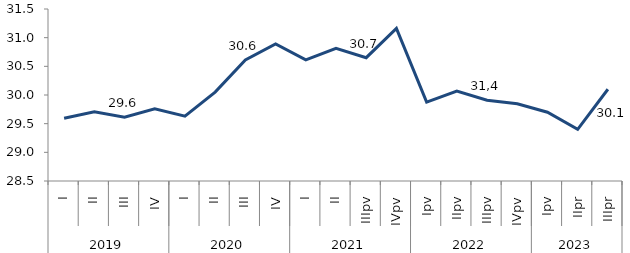
| Category | Series 0 |
|---|---|
| 0 | 29.595 |
| 1 | 29.707 |
| 2 | 29.612 |
| 3 | 29.758 |
| 4 | 29.631 |
| 5 | 30.051 |
| 6 | 30.612 |
| 7 | 30.89 |
| 8 | 30.612 |
| 9 | 30.813 |
| 10 | 30.651 |
| 11 | 31.16 |
| 12 | 29.877 |
| 13 | 30.067 |
| 14 | 29.908 |
| 15 | 29.848 |
| 16 | 29.7 |
| 17 | 29.4 |
| 18 | 30.1 |